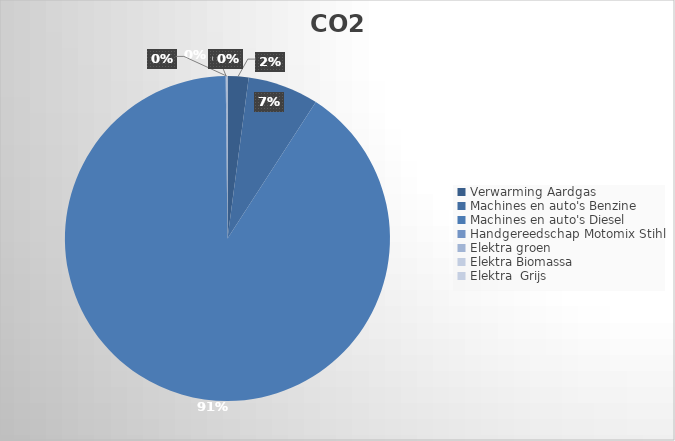
| Category | Ton CO2 | Series 1 |
|---|---|---|
| 0 | 0.723 |  |
| 1 | 2.45 |  |
| 2 | 31.446 |  |
| 3 | 0.031 |  |
| 4 | 0 |  |
| 5 | 0.029 |  |
| 6 | 0.003 |  |